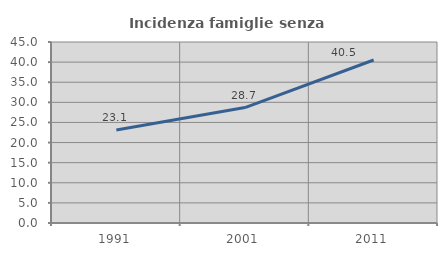
| Category | Incidenza famiglie senza nuclei |
|---|---|
| 1991.0 | 23.132 |
| 2001.0 | 28.691 |
| 2011.0 | 40.526 |